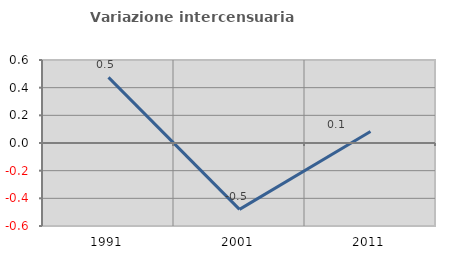
| Category | Variazione intercensuaria annua |
|---|---|
| 1991.0 | 0.475 |
| 2001.0 | -0.48 |
| 2011.0 | 0.084 |